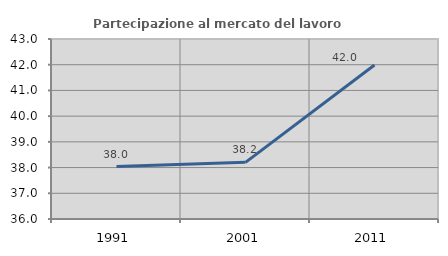
| Category | Partecipazione al mercato del lavoro  femminile |
|---|---|
| 1991.0 | 38.041 |
| 2001.0 | 38.204 |
| 2011.0 | 41.989 |